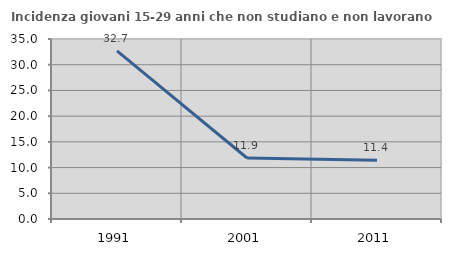
| Category | Incidenza giovani 15-29 anni che non studiano e non lavorano  |
|---|---|
| 1991.0 | 32.684 |
| 2001.0 | 11.864 |
| 2011.0 | 11.404 |